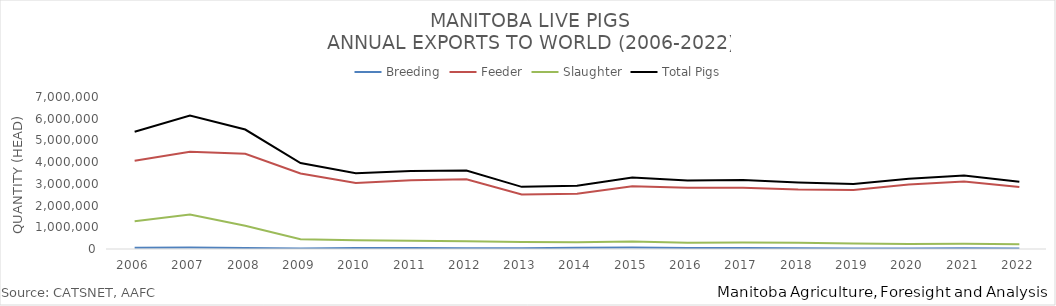
| Category | Breeding | Feeder | Slaughter | Total Pigs |
|---|---|---|---|---|
| 2006 | 59105 | 4066357 | 1276288 | 5401750 |
| 2007 | 73298 | 4479810 | 1593357 | 6146465 |
| 2008 | 48103 | 4383172 | 1069622 | 5500897 |
| 2009 | 28439 | 3478459 | 453389 | 3960287 |
| 2010 | 44967 | 3042429 | 406800 | 3494196 |
| 2011 | 50828 | 3161424 | 377265 | 3589517 |
| 2012 | 39038 | 3212162 | 358564 | 3609764 |
| 2013 | 30677 | 2513275 | 317445 | 2861397 |
| 2014 | 62427 | 2546167 | 308748 | 2917342 |
| 2015 | 63892 | 2887052 | 341008 | 3291952 |
| 2016 | 50322 | 2821605 | 286910 | 3158837 |
| 2017 | 47613 | 2825456 | 300591 | 3173660 |
| 2018 | 33135 | 2738801 | 287995 | 3059931 |
| 2019 | 22283 | 2713769 | 258640 | 2994692 |
| 2020 | 26017 | 2973459 | 234293 | 3233769 |
| 2021 | 31143 | 3113866 | 240883 | 3385892 |
| 2022 | 18448 | 2854337 | 223590 | 3096375 |